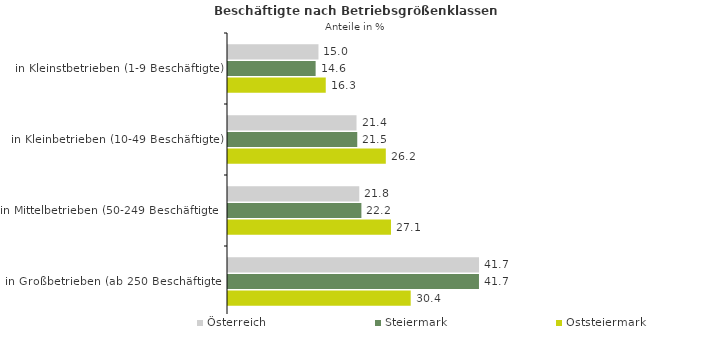
| Category | Österreich | Steiermark | Oststeiermark |
|---|---|---|---|
| in Kleinstbetrieben (1-9 Beschäftigte) | 15.046 | 14.574 | 16.258 |
| in Kleinbetrieben (10-49 Beschäftigte) | 21.375 | 21.498 | 26.247 |
| in Mittelbetrieben (50-249 Beschäftigte) | 21.831 | 22.187 | 27.107 |
| in Großbetrieben (ab 250 Beschäftigte) | 41.748 | 41.742 | 30.388 |